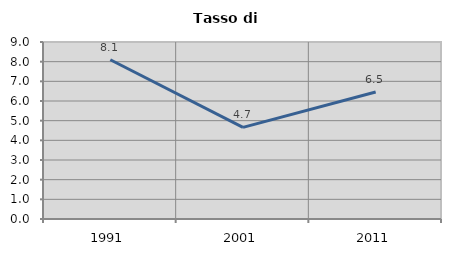
| Category | Tasso di disoccupazione   |
|---|---|
| 1991.0 | 8.096 |
| 2001.0 | 4.661 |
| 2011.0 | 6.455 |